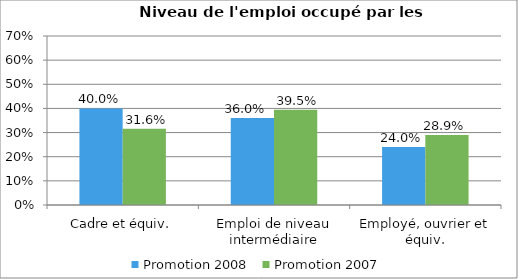
| Category | Promotion 2008 | Promotion 2007 |
|---|---|---|
| Cadre et équiv. | 0.4 | 0.316 |
| Emploi de niveau intermédiaire | 0.36 | 0.395 |
| Employé, ouvrier et équiv. | 0.24 | 0.289 |